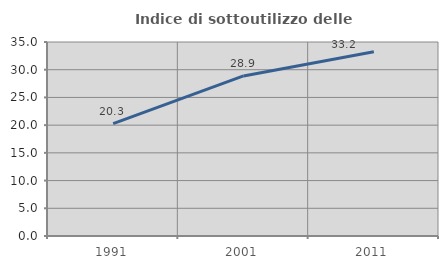
| Category | Indice di sottoutilizzo delle abitazioni  |
|---|---|
| 1991.0 | 20.276 |
| 2001.0 | 28.879 |
| 2011.0 | 33.242 |